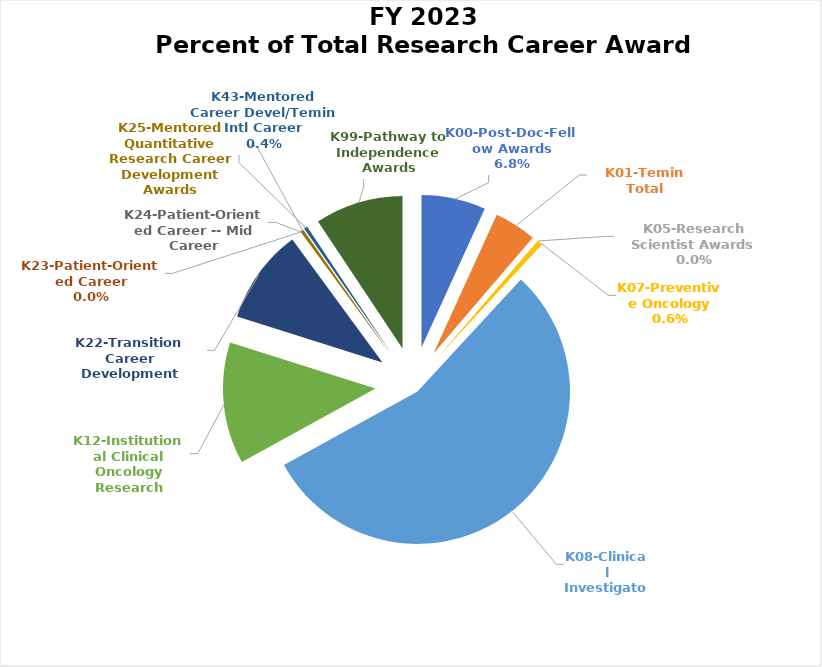
| Category | Series 0 |
|---|---|
| K00-Post-Doc-Fellow Awards | 0.068 |
| K01-Temin Total | 0.045 |
| K05-Research Scientist Awards | 0 |
| K07-Preventive Oncology | 0.006 |
| K08-Clinical Investigator | 0.551 |
| K12-Institutional Clinical Oncology Research | 0.129 |
| K22-Transition Career Development | 0.101 |
| K23-Patient-Oriented Career | 0 |
| K24-Patient-Oriented Career -- Mid Career | 0 |
| K25-Mentored Quantitative Research Career Development Awards | 0.003 |
| K43-Mentored Career Devel/Temin Intl Career | 0.004 |
| K99-Pathway to Independence Awards | 0.093 |